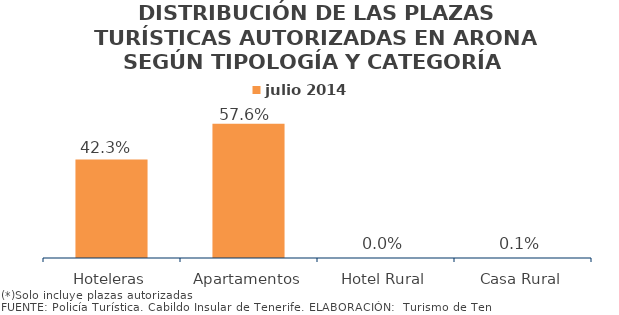
| Category | julio 2014 |
|---|---|
| Hoteleras | 0.423 |
| Apartamentos | 0.576 |
| Hotel Rural | 0 |
| Casa Rural | 0.001 |